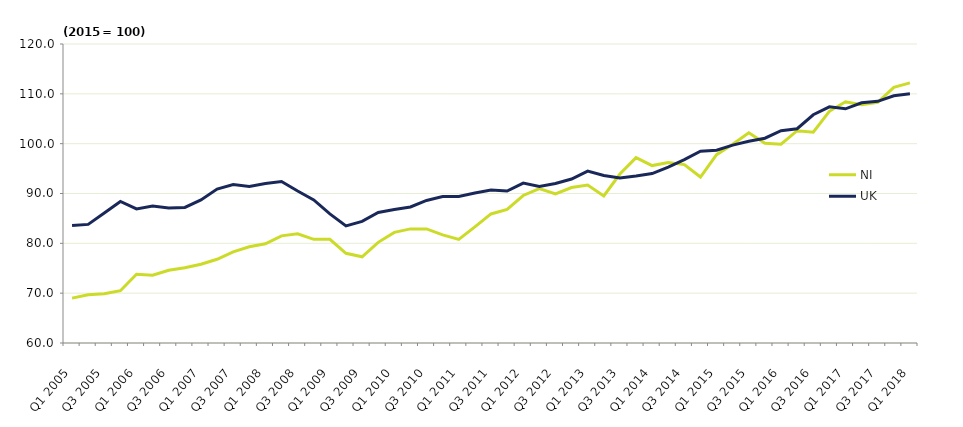
| Category | NI  | UK  |
|---|---|---|
| Q1 2005 | 69 | 83.6 |
| Q2 2005 | 69.7 | 83.8 |
| Q3 2005 | 69.9 | 86.1 |
| Q4 2005 | 70.5 | 88.4 |
| Q1 2006 | 73.8 | 86.9 |
| Q2 2006 | 73.6 | 87.5 |
| Q3 2006 | 74.6 | 87.1 |
| Q4 2006 | 75.1 | 87.2 |
| Q1 2007 | 75.8 | 88.7 |
| Q2 2007 | 76.8 | 90.9 |
| Q3 2007 | 78.3 | 91.8 |
| Q4 2007 | 79.3 | 91.4 |
| Q1 2008 | 79.9 | 92 |
| Q2 2008 | 81.5 | 92.4 |
| Q3 2008 | 81.9 | 90.5 |
| Q4 2008 | 80.8 | 88.7 |
| Q1 2009 | 80.8 | 85.9 |
| Q2 2009 | 78 | 83.5 |
| Q3 2009 | 77.3 | 84.4 |
| Q4 2009 | 80.2 | 86.2 |
| Q1 2010 | 82.2 | 86.8 |
| Q2 2010 | 82.9 | 87.3 |
| Q3 2010 | 82.9 | 88.6 |
| Q4 2010 | 81.7 | 89.4 |
| Q1 2011 | 80.8 | 89.4 |
| Q2 2011 | 83.3 | 90.1 |
| Q3 2011 | 85.9 | 90.7 |
| Q4 2011 | 86.8 | 90.5 |
| Q1 2012 | 89.6 | 92.1 |
| Q2 2012 | 91 | 91.4 |
| Q3 2012 | 89.9 | 92 |
| Q4 2012 | 91.2 | 92.9 |
| Q1 2013 | 91.7 | 94.5 |
| Q2 2013 | 89.5 | 93.6 |
| Q3 2013 | 93.9 | 93.1 |
| Q4 2013 | 97.2 | 93.5 |
| Q1 2014 | 95.6 | 94 |
| Q2 2014 | 96.2 | 95.3 |
| Q3 2014 | 95.8 | 96.8 |
| Q4 2014 | 93.3 | 98.5 |
| Q1 2015 | 97.8 | 98.7 |
| Q2 2015 | 99.9 | 99.7 |
| Q3 2015 | 102.2 | 100.5 |
| Q4 2015 | 100.1 | 101.1 |
| Q1 2016 | 99.9 | 102.6 |
| Q2 2016 | 102.6 | 103 |
| Q3 2016 | 102.3 | 105.8 |
| Q4 2016 | 106.5 | 107.4 |
| Q1 2017 | 108.4 | 107 |
| Q2 2017 | 107.8 | 108.2 |
| Q3 2017 | 108.3 | 108.5 |
| Q4 2017 | 111.3 | 109.6 |
| Q1 2018 | 112.2 | 110 |